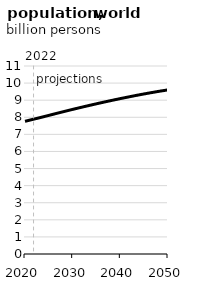
| Category | Series 6 |
|---|---|
| 2020.0 | 7764.314 |
| 2021.0 | 7833.97 |
| 2022.0 | 7901.456 |
| 2023.0 | 7968.141 |
| 2024.0 | 8039.318 |
| 2025.0 | 8110.81 |
| 2026.0 | 8182.327 |
| 2027.0 | 8253.339 |
| 2028.0 | 8323.724 |
| 2029.0 | 8393.281 |
| 2030.0 | 8461.674 |
| 2031.0 | 8528.924 |
| 2032.0 | 8595.378 |
| 2033.0 | 8660.954 |
| 2034.0 | 8725.629 |
| 2035.0 | 8789.356 |
| 2036.0 | 8852.108 |
| 2037.0 | 8913.852 |
| 2038.0 | 8974.538 |
| 2039.0 | 9034.1 |
| 2040.0 | 9092.504 |
| 2041.0 | 9149.788 |
| 2042.0 | 9205.904 |
| 2043.0 | 9260.787 |
| 2044.0 | 9314.313 |
| 2045.0 | 9366.312 |
| 2046.0 | 9416.733 |
| 2047.0 | 9465.632 |
| 2048.0 | 9513.012 |
| 2049.0 | 9558.874 |
| 2050.0 | 9603.238 |